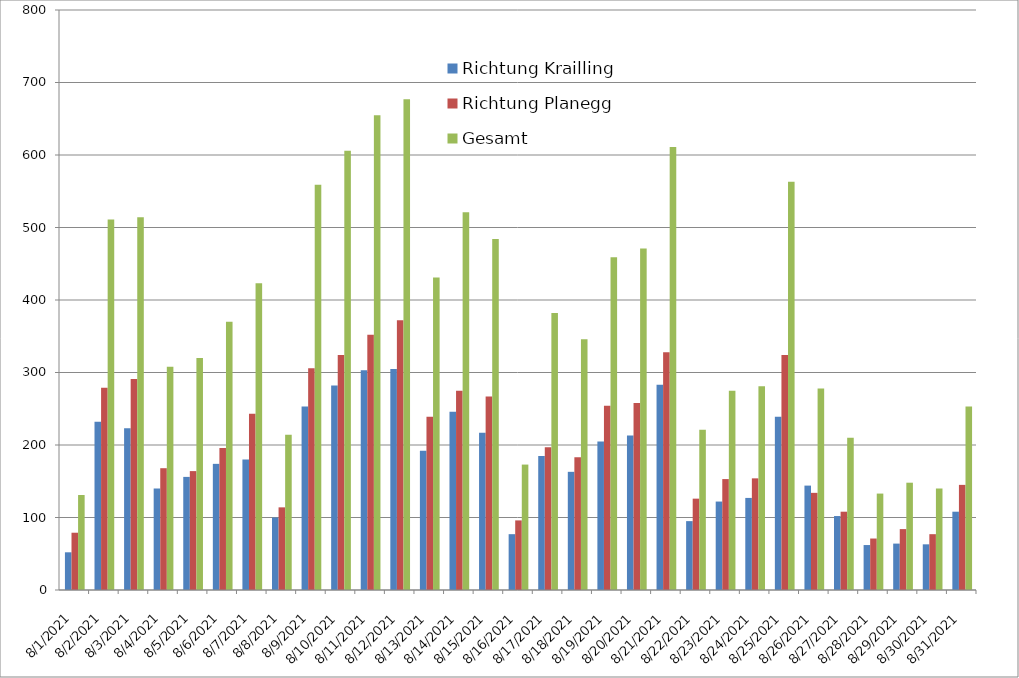
| Category | Richtung Krailling | Richtung Planegg | Gesamt |
|---|---|---|---|
| 8/1/21 | 52 | 79 | 131 |
| 8/2/21 | 232 | 279 | 511 |
| 8/3/21 | 223 | 291 | 514 |
| 8/4/21 | 140 | 168 | 308 |
| 8/5/21 | 156 | 164 | 320 |
| 8/6/21 | 174 | 196 | 370 |
| 8/7/21 | 180 | 243 | 423 |
| 8/8/21 | 100 | 114 | 214 |
| 8/9/21 | 253 | 306 | 559 |
| 8/10/21 | 282 | 324 | 606 |
| 8/11/21 | 303 | 352 | 655 |
| 8/12/21 | 305 | 372 | 677 |
| 8/13/21 | 192 | 239 | 431 |
| 8/14/21 | 246 | 275 | 521 |
| 8/15/21 | 217 | 267 | 484 |
| 8/16/21 | 77 | 96 | 173 |
| 8/17/21 | 185 | 197 | 382 |
| 8/18/21 | 163 | 183 | 346 |
| 8/19/21 | 205 | 254 | 459 |
| 8/20/21 | 213 | 258 | 471 |
| 8/21/21 | 283 | 328 | 611 |
| 8/22/21 | 95 | 126 | 221 |
| 8/23/21 | 122 | 153 | 275 |
| 8/24/21 | 127 | 154 | 281 |
| 8/25/21 | 239 | 324 | 563 |
| 8/26/21 | 144 | 134 | 278 |
| 8/27/21 | 102 | 108 | 210 |
| 8/28/21 | 62 | 71 | 133 |
| 8/29/21 | 64 | 84 | 148 |
| 8/30/21 | 63 | 77 | 140 |
| 8/31/21 | 108 | 145 | 253 |